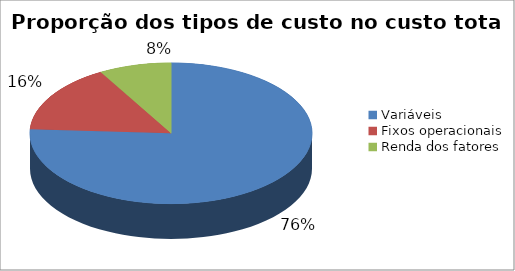
| Category | Series 0 |
|---|---|
| Variáveis | 111499.092 |
| Fixos operacionais | 23233.601 |
| Renda dos fatores | 12179.53 |